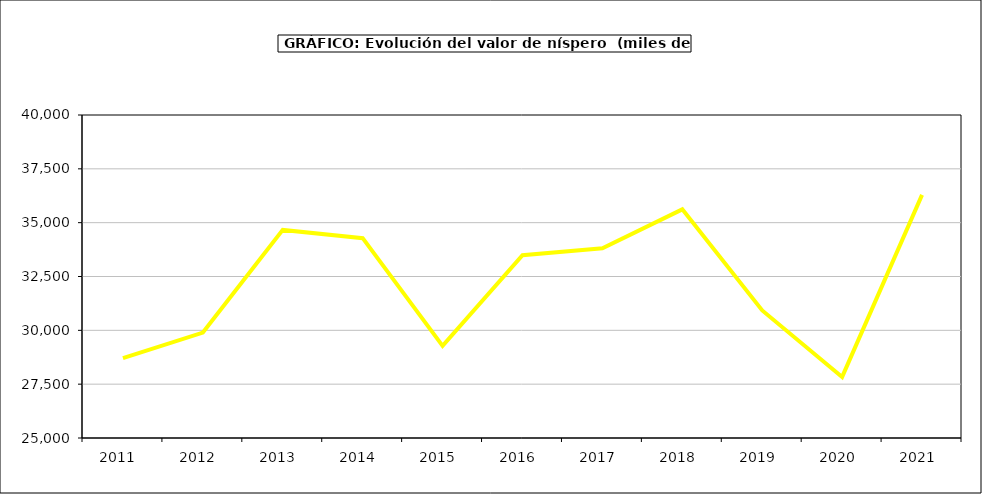
| Category | valor níspero |
|---|---|
| 2011.0 | 28708.277 |
| 2012.0 | 29897.05 |
| 2013.0 | 34664.445 |
| 2014.0 | 34281.045 |
| 2015.0 | 29278 |
| 2016.0 | 33490 |
| 2017.0 | 33807.127 |
| 2018.0 | 35617.316 |
| 2019.0 | 30923.726 |
| 2020.0 | 27836.442 |
| 2021.0 | 36288.539 |